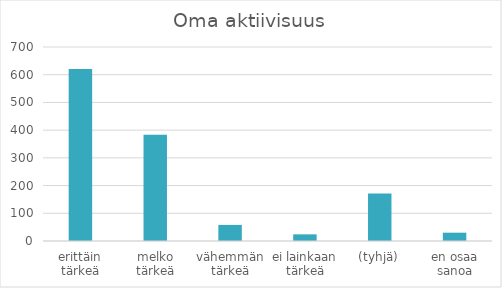
| Category | Summa |
|---|---|
| erittäin tärkeä | 621 |
| melko tärkeä | 383 |
| vähemmän tärkeä | 58 |
| ei lainkaan tärkeä | 24 |
| (tyhjä) | 171 |
| en osaa sanoa | 30 |